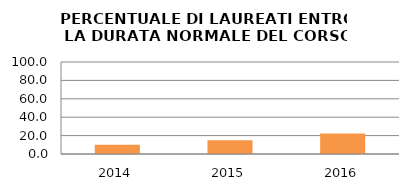
| Category | 2014 2015 2016 |
|---|---|
| 2014.0 | 10 |
| 2015.0 | 15 |
| 2016.0 | 22.222 |